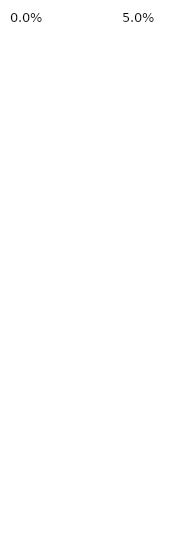
| Category | Series 0 | Series 1 |
|---|---|---|
| 0 | 0.04 | 0 |
| 1 | 0.04 | 0 |
| 2 | 0.04 | 0 |
| 3 | 0.04 | 0 |
| 4 | 0.04 | 0 |
| 5 | 0.04 | 0 |
| 6 | 0.04 | 0 |
| 7 | 0.04 | 0 |